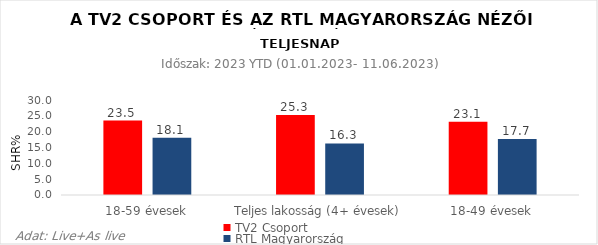
| Category | TV2 Csoport | RTL Magyarország |
|---|---|---|
| 18-59 évesek | 23.5 | 18.1 |
| Teljes lakosság (4+ évesek) | 25.3 | 16.3 |
| 18-49 évesek | 23.1 | 17.7 |